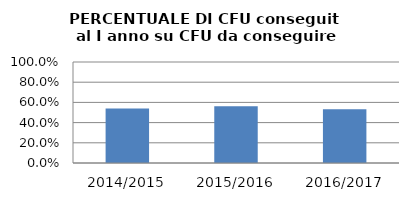
| Category | 2014/2015 2015/2016 2016/2017 |
|---|---|
| 2014/2015 | 0.539 |
| 2015/2016 | 0.561 |
| 2016/2017 | 0.531 |